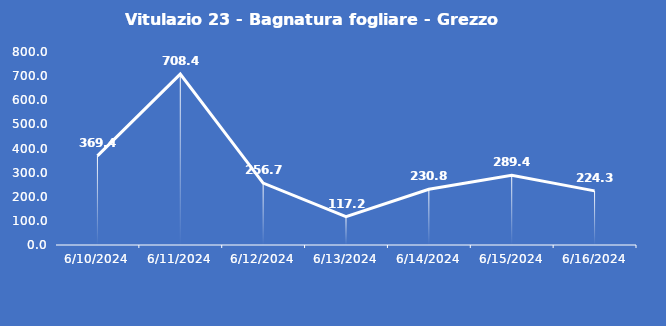
| Category | Vitulazio 23 - Bagnatura fogliare - Grezzo (min) |
|---|---|
| 6/10/24 | 369.4 |
| 6/11/24 | 708.4 |
| 6/12/24 | 256.7 |
| 6/13/24 | 117.2 |
| 6/14/24 | 230.8 |
| 6/15/24 | 289.4 |
| 6/16/24 | 224.3 |